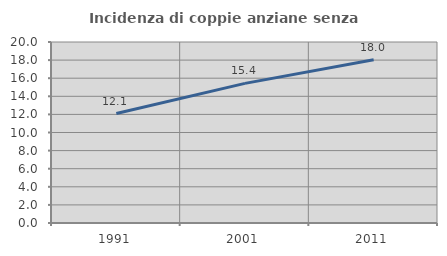
| Category | Incidenza di coppie anziane senza figli  |
|---|---|
| 1991.0 | 12.096 |
| 2001.0 | 15.429 |
| 2011.0 | 18.048 |